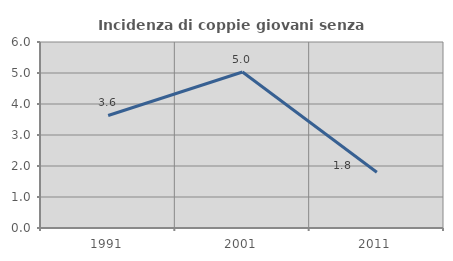
| Category | Incidenza di coppie giovani senza figli |
|---|---|
| 1991.0 | 3.63 |
| 2001.0 | 5.034 |
| 2011.0 | 1.799 |